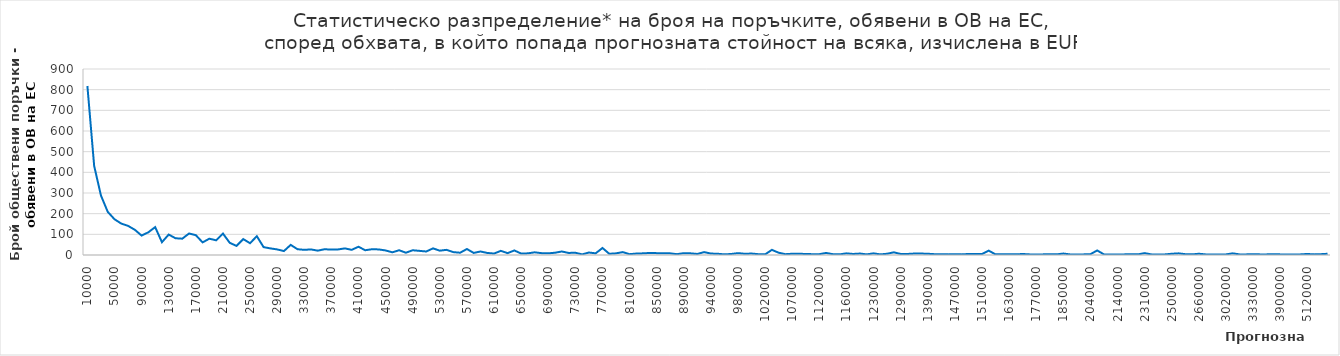
| Category | Series 0 |
|---|---|
| 10000.0 | 818 |
| 20000.0 | 431 |
| 30000.0 | 288 |
| 40000.0 | 209 |
| 50000.0 | 173 |
| 60000.0 | 152 |
| 70000.0 | 141 |
| 80000.0 | 122 |
| 90000.0 | 94 |
| 100000.0 | 110 |
| 110000.0 | 135 |
| 120000.0 | 62 |
| 130000.0 | 99 |
| 140000.0 | 81 |
| 150000.0 | 79 |
| 160000.0 | 104 |
| 170000.0 | 96 |
| 180000.0 | 61 |
| 190000.0 | 79 |
| 200000.0 | 71 |
| 210000.0 | 104 |
| 220000.0 | 59 |
| 230000.0 | 44 |
| 240000.0 | 77 |
| 250000.0 | 57 |
| 260000.0 | 91 |
| 270000.0 | 38 |
| 280000.0 | 32 |
| 290000.0 | 27 |
| 300000.0 | 19 |
| 310000.0 | 49 |
| 320000.0 | 28 |
| 330000.0 | 25 |
| 340000.0 | 27 |
| 350000.0 | 21 |
| 360000.0 | 28 |
| 370000.0 | 26 |
| 380000.0 | 27 |
| 390000.0 | 32 |
| 400000.0 | 25 |
| 410000.0 | 40 |
| 420000.0 | 23 |
| 430000.0 | 28 |
| 440000.0 | 27 |
| 450000.0 | 22 |
| 460000.0 | 13 |
| 470000.0 | 23 |
| 480000.0 | 11 |
| 490000.0 | 23 |
| 500000.0 | 20 |
| 510000.0 | 17 |
| 520000.0 | 32 |
| 530000.0 | 21 |
| 540000.0 | 25 |
| 550000.0 | 14 |
| 560000.0 | 11 |
| 570000.0 | 29 |
| 580000.0 | 10 |
| 590000.0 | 17 |
| 600000.0 | 10 |
| 610000.0 | 7 |
| 620000.0 | 20 |
| 630000.0 | 9 |
| 640000.0 | 22 |
| 650000.0 | 7 |
| 660000.0 | 8 |
| 670000.0 | 13 |
| 680000.0 | 9 |
| 690000.0 | 8 |
| 700000.0 | 11 |
| 710000.0 | 17 |
| 720000.0 | 10 |
| 730000.0 | 11 |
| 740000.0 | 3 |
| 750000.0 | 12 |
| 760000.0 | 8 |
| 770000.0 | 34 |
| 780000.0 | 6 |
| 790000.0 | 8 |
| 800000.0 | 14 |
| 810000.0 | 4 |
| 820000.0 | 7 |
| 830000.0 | 8 |
| 840000.0 | 10 |
| 850000.0 | 9 |
| 860000.0 | 9 |
| 870000.0 | 8 |
| 880000.0 | 4 |
| 890000.0 | 9 |
| 900000.0 | 8 |
| 910000.0 | 5 |
| 930000.0 | 14 |
| 940000.0 | 7 |
| 950000.0 | 6 |
| 960000.0 | 3 |
| 970000.0 | 5 |
| 980000.0 | 9 |
| 990000.0 | 6 |
| 1000000.0 | 7 |
| 1010000.0 | 4 |
| 1020000.0 | 3 |
| 1030000.0 | 25 |
| 1040000.0 | 11 |
| 1060000.0 | 4 |
| 1070000.0 | 6 |
| 1080000.0 | 6 |
| 1090000.0 | 5 |
| 1110000.0 | 4 |
| 1120000.0 | 4 |
| 1130000.0 | 10 |
| 1140000.0 | 4 |
| 1150000.0 | 3 |
| 1160000.0 | 8 |
| 1200000.0 | 5 |
| 1210000.0 | 7 |
| 1220000.0 | 3 |
| 1230000.0 | 8 |
| 1250000.0 | 3 |
| 1270000.0 | 6 |
| 1280000.0 | 13 |
| 1290000.0 | 5 |
| 1310000.0 | 5 |
| 1330000.0 | 7 |
| 1340000.0 | 7 |
| 1390000.0 | 6 |
| 1410000.0 | 4 |
| 1440000.0 | 4 |
| 1450000.0 | 3 |
| 1470000.0 | 4 |
| 1480000.0 | 3 |
| 1490000.0 | 5 |
| 1500000.0 | 5 |
| 1510000.0 | 5 |
| 1540000.0 | 21 |
| 1580000.0 | 3 |
| 1590000.0 | 4 |
| 1630000.0 | 4 |
| 1670000.0 | 3 |
| 1700000.0 | 5 |
| 1740000.0 | 3 |
| 1770000.0 | 3 |
| 1780000.0 | 3 |
| 1810000.0 | 4 |
| 1820000.0 | 3 |
| 1850000.0 | 7 |
| 1880000.0 | 3 |
| 1920000.0 | 3 |
| 2030000.0 | 3 |
| 2040000.0 | 4 |
| 2050000.0 | 22 |
| 2070000.0 | 3 |
| 2100000.0 | 3 |
| 2140000.0 | 3 |
| 2180000.0 | 3 |
| 2200000.0 | 4 |
| 2250000.0 | 3 |
| 2310000.0 | 9 |
| 2390000.0 | 3 |
| 2430000.0 | 3 |
| 2470000.0 | 3 |
| 2500000.0 | 6 |
| 2560000.0 | 8 |
| 2590000.0 | 4 |
| 2600000.0 | 3 |
| 2660000.0 | 6 |
| 2670000.0 | 3 |
| 2820000.0 | 3 |
| 2910000.0 | 3 |
| 3020000.0 | 3 |
| 3070000.0 | 8 |
| 3080000.0 | 3 |
| 3180000.0 | 3 |
| 3330000.0 | 4 |
| 3390000.0 | 3 |
| 3580000.0 | 3 |
| 3690000.0 | 4 |
| 3900000.0 | 3 |
| 4100000.0 | 3 |
| 4280000.0 | 3 |
| 4610000.0 | 3 |
| 5120000.0 | 5 |
| 5370000.0 | 3 |
| 7670000.0 | 4 |
| 15340000.0 | 6 |